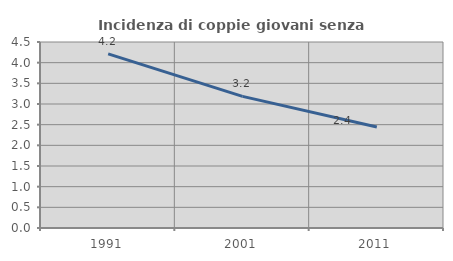
| Category | Incidenza di coppie giovani senza figli |
|---|---|
| 1991.0 | 4.214 |
| 2001.0 | 3.185 |
| 2011.0 | 2.442 |